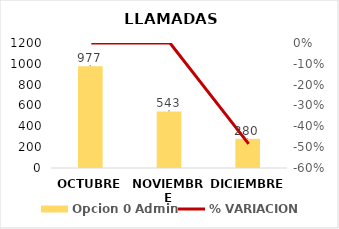
| Category | Opcion 0 Admin |
|---|---|
| OCTUBRE | 977 |
| NOVIEMBRE | 543 |
| DICIEMBRE | 280 |